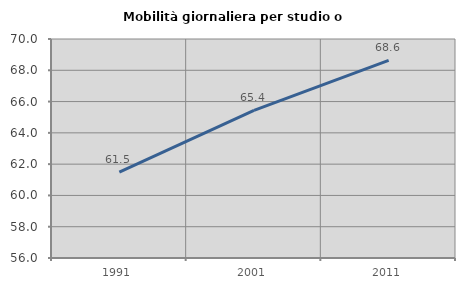
| Category | Mobilità giornaliera per studio o lavoro |
|---|---|
| 1991.0 | 61.489 |
| 2001.0 | 65.435 |
| 2011.0 | 68.636 |